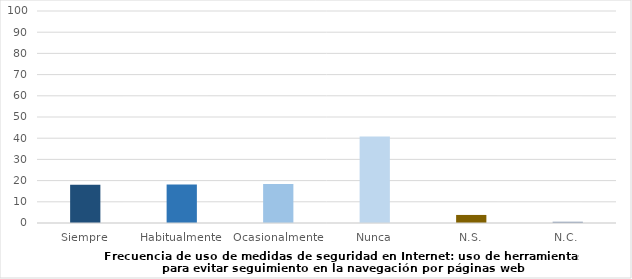
| Category | Series 0 |
|---|---|
| Siempre | 18 |
| Habitualmente | 18.2 |
| Ocasionalmente | 18.4 |
| Nunca | 40.8 |
| N.S. | 3.8 |
| N.C. | 0.6 |